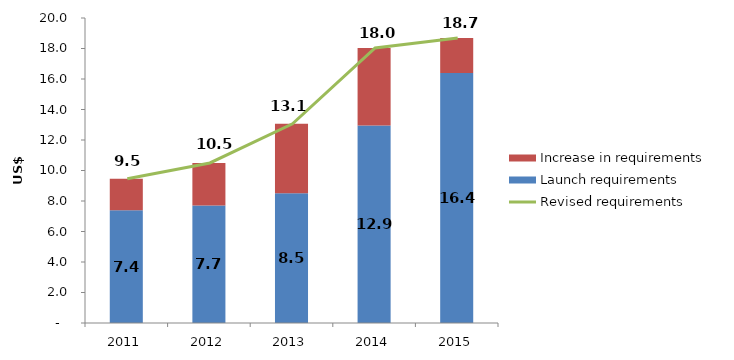
| Category | Launch requirements | Increase in requirements |
|---|---|---|
| 2011.0 | 7.4 | 2.059 |
| 2012.0 | 7.7 | 2.796 |
| 2013.0 | 8.507 | 4.554 |
| 2014.0 | 12.949 | 5.087 |
| 2015.0 | 16.386 | 2.305 |